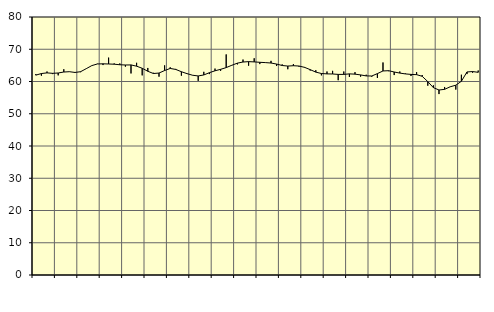
| Category | Piggar | Series 1 |
|---|---|---|
| nan | 62.3 | 61.97 |
| 1.0 | 61.8 | 62.47 |
| 1.0 | 63.1 | 62.67 |
| 1.0 | 62.3 | 62.53 |
| nan | 61.9 | 62.64 |
| 2.0 | 63.8 | 62.94 |
| 2.0 | 63 | 63.04 |
| 2.0 | 62.7 | 62.81 |
| nan | 62.9 | 63.04 |
| 3.0 | 64 | 63.97 |
| 3.0 | 64.9 | 64.93 |
| 3.0 | 65.5 | 65.44 |
| nan | 65.1 | 65.48 |
| 4.0 | 67.4 | 65.43 |
| 4.0 | 65.6 | 65.36 |
| 4.0 | 65.6 | 65.19 |
| nan | 64.6 | 65.12 |
| 5.0 | 62.5 | 65.14 |
| 5.0 | 65.8 | 64.75 |
| 5.0 | 61.9 | 64.1 |
| nan | 64.2 | 63.17 |
| 6.0 | 62.7 | 62.48 |
| 6.0 | 61.5 | 62.62 |
| 6.0 | 65 | 63.4 |
| nan | 64.4 | 64.05 |
| 7.0 | 63.9 | 63.74 |
| 7.0 | 61.8 | 63.03 |
| 7.0 | 62.5 | 62.44 |
| nan | 61.9 | 61.94 |
| 8.0 | 60.2 | 61.72 |
| 8.0 | 63 | 62.03 |
| 8.0 | 62.3 | 62.73 |
| nan | 64 | 63.32 |
| 9.0 | 63.3 | 63.77 |
| 9.0 | 68.4 | 64.31 |
| 9.0 | 65.1 | 65.03 |
| nan | 65.3 | 65.69 |
| 10.0 | 66.8 | 66.04 |
| 10.0 | 64.9 | 66.16 |
| 10.0 | 67.2 | 66.08 |
| nan | 65.4 | 65.95 |
| 11.0 | 65.9 | 65.86 |
| 11.0 | 66.4 | 65.73 |
| 11.0 | 64.8 | 65.41 |
| nan | 65.3 | 64.96 |
| 12.0 | 63.8 | 64.79 |
| 12.0 | 65.4 | 64.89 |
| 12.0 | 64.6 | 64.8 |
| nan | 64.5 | 64.38 |
| 13.0 | 63.4 | 63.68 |
| 13.0 | 63.5 | 62.91 |
| 13.0 | 61.9 | 62.48 |
| nan | 63.1 | 62.36 |
| 14.0 | 63.3 | 62.33 |
| 14.0 | 60.4 | 62.2 |
| 14.0 | 63.1 | 62.2 |
| nan | 61.4 | 62.36 |
| 15.0 | 62.9 | 62.28 |
| 15.0 | 61.5 | 62.04 |
| 15.0 | 62.1 | 61.73 |
| nan | 61.5 | 61.71 |
| 16.0 | 61.1 | 62.45 |
| 16.0 | 65.9 | 63.27 |
| 16.0 | 63.2 | 63.35 |
| nan | 62 | 62.95 |
| 17.0 | 63.1 | 62.61 |
| 17.0 | 62.5 | 62.35 |
| 17.0 | 61.7 | 62.2 |
| nan | 62.9 | 62.12 |
| 18.0 | 62 | 61.61 |
| 18.0 | 58.7 | 59.96 |
| 18.0 | 58.8 | 58.1 |
| nan | 56.1 | 57.36 |
| 19.0 | 58.3 | 57.57 |
| 19.0 | 58.4 | 58.36 |
| 19.0 | 57.5 | 58.85 |
| nan | 62.1 | 60.08 |
| 20.0 | 62.3 | 62.96 |
| 20.0 | 62.7 | 63.09 |
| 20.0 | 63.4 | 62.84 |